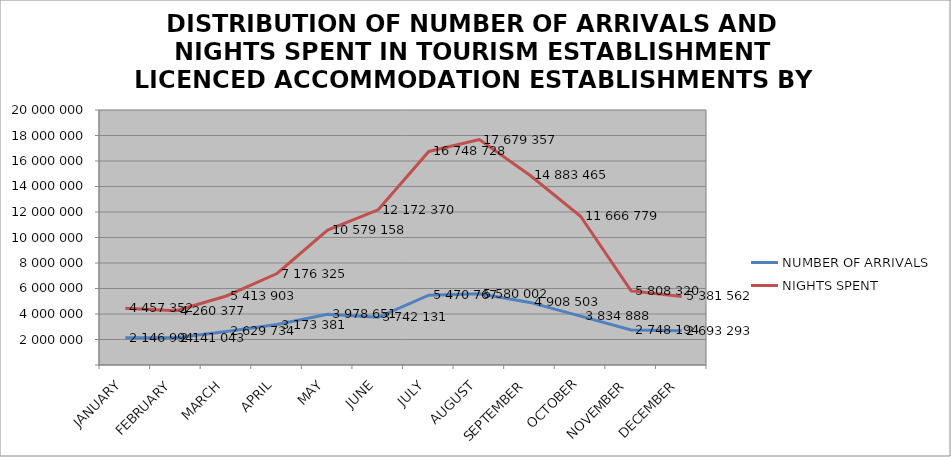
| Category | NUMBER OF ARRIVALS | NIGHTS SPENT |
|---|---|---|
| JANUARY | 2146994 | 4457352 |
| FEBRUARY | 2141043 | 4260377 |
| MARCH | 2629734 | 5413903 |
| APRIL | 3173381 | 7176325 |
| MAY | 3978651 | 10579158 |
| JUNE | 3742131 | 12172370 |
| JULY | 5470767 | 16748728 |
| AUGUST | 5580002 | 17679357 |
| SEPTEMBER | 4908503 | 14883465 |
| OCTOBER | 3834888 | 11666779 |
| NOVEMBER | 2748194 | 5808320 |
| DECEMBER | 2693293 | 5381562 |